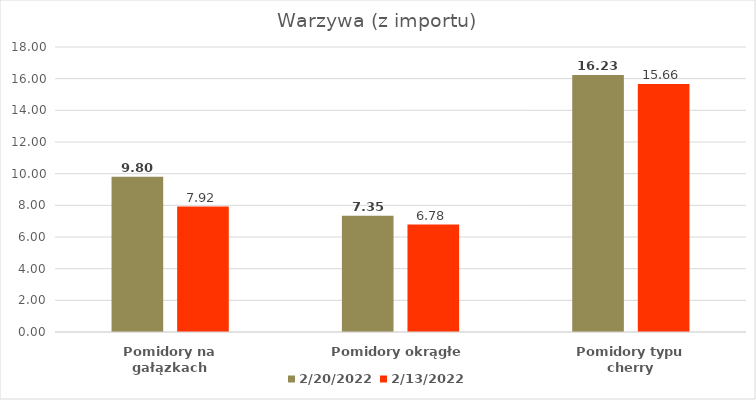
| Category | 20.02.2022 | 13.02.2022 |
|---|---|---|
| Pomidory na gałązkach | 9.8 | 7.924 |
| Pomidory okrągłe | 7.35 | 6.783 |
| Pomidory typu cherry | 16.23 | 15.659 |